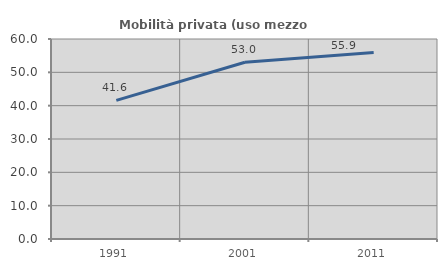
| Category | Mobilità privata (uso mezzo privato) |
|---|---|
| 1991.0 | 41.573 |
| 2001.0 | 53.016 |
| 2011.0 | 55.916 |